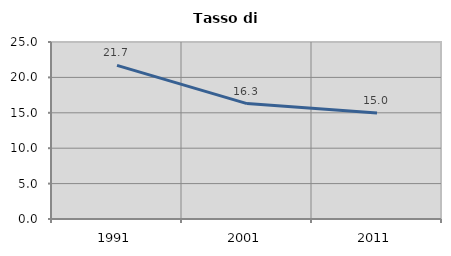
| Category | Tasso di disoccupazione   |
|---|---|
| 1991.0 | 21.694 |
| 2001.0 | 16.299 |
| 2011.0 | 14.97 |